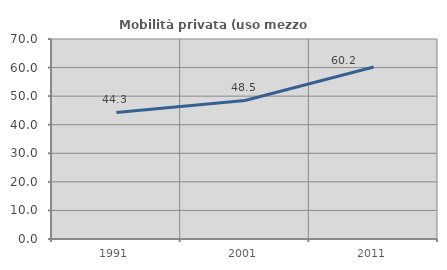
| Category | Mobilità privata (uso mezzo privato) |
|---|---|
| 1991.0 | 44.292 |
| 2001.0 | 48.498 |
| 2011.0 | 60.197 |